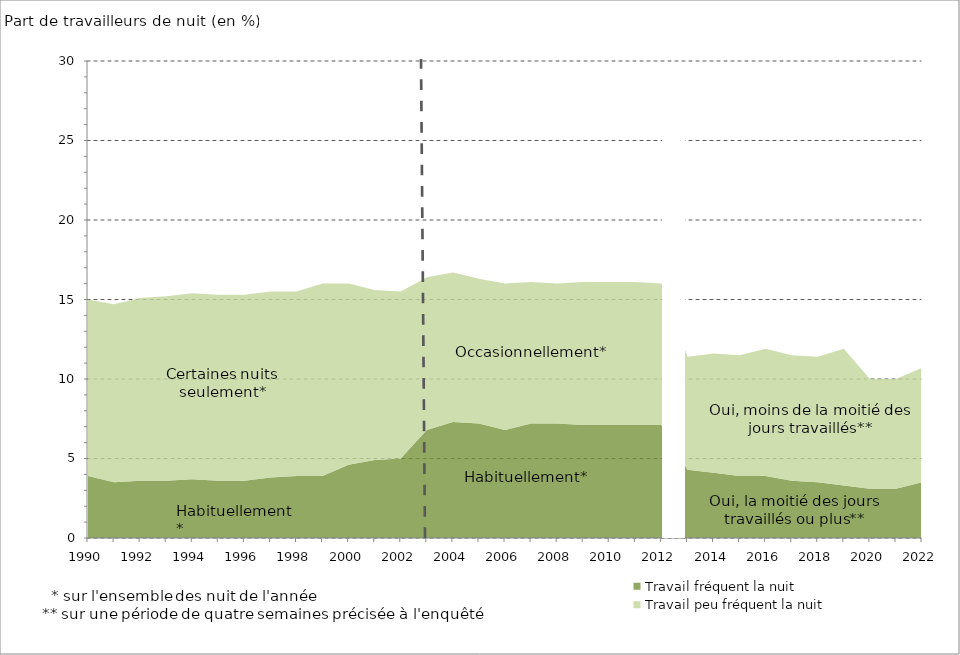
| Category | Travail fréquent la nuit | Travail peu fréquent la nuit |
|---|---|---|
| 1990.0 | 3.9 | 11.1 |
| 1991.0 | 3.5 | 11.2 |
| 1992.0 | 3.6 | 11.5 |
| 1993.0 | 3.6 | 11.6 |
| 1994.0 | 3.7 | 11.7 |
| 1995.0 | 3.6 | 11.7 |
| 1996.0 | 3.6 | 11.7 |
| 1997.0 | 3.8 | 11.7 |
| 1998.0 | 3.9 | 11.6 |
| 1999.0 | 3.9 | 12.1 |
| 2000.0 | 4.6 | 11.4 |
| 2001.0 | 4.9 | 10.7 |
| 2002.0 | 5 | 10.5 |
| 2003.0 | 6.8 | 9.6 |
| 2004.0 | 7.3 | 9.4 |
| 2005.0 | 7.2 | 9.1 |
| 2006.0 | 6.8 | 9.2 |
| 2007.0 | 7.2 | 8.9 |
| 2008.0 | 7.2 | 8.8 |
| 2009.0 | 7.1 | 9 |
| 2010.0 | 7.1 | 9 |
| 2011.0 | 7.1 | 9 |
| 2012.0 | 7.1 | 8.9 |
| 2013.0 | 4.3 | 7.1 |
| 2014.0 | 4.1 | 7.5 |
| 2015.0 | 3.9 | 7.6 |
| 2016.0 | 3.9 | 8 |
| 2017.0 | 3.6 | 7.9 |
| 2018.0 | 3.5 | 7.9 |
| 2019.0 | 3.3 | 8.6 |
| 2020.0 | 3.1 | 6.9 |
| 2021.0 | 3.1 | 6.9 |
| 2022.0 | 3.5 | 7.2 |